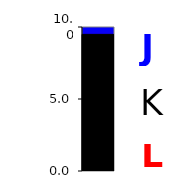
| Category | Series 0 |
|---|---|
| 0 | 9.488 |